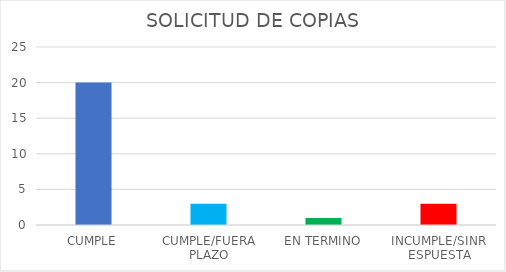
| Category | Series 0 |
|---|---|
| CUMPLE | 20 |
| CUMPLE/FUERA PLAZO | 3 |
| EN TERMINO | 1 |
| INCUMPLE/SINR ESPUESTA | 3 |